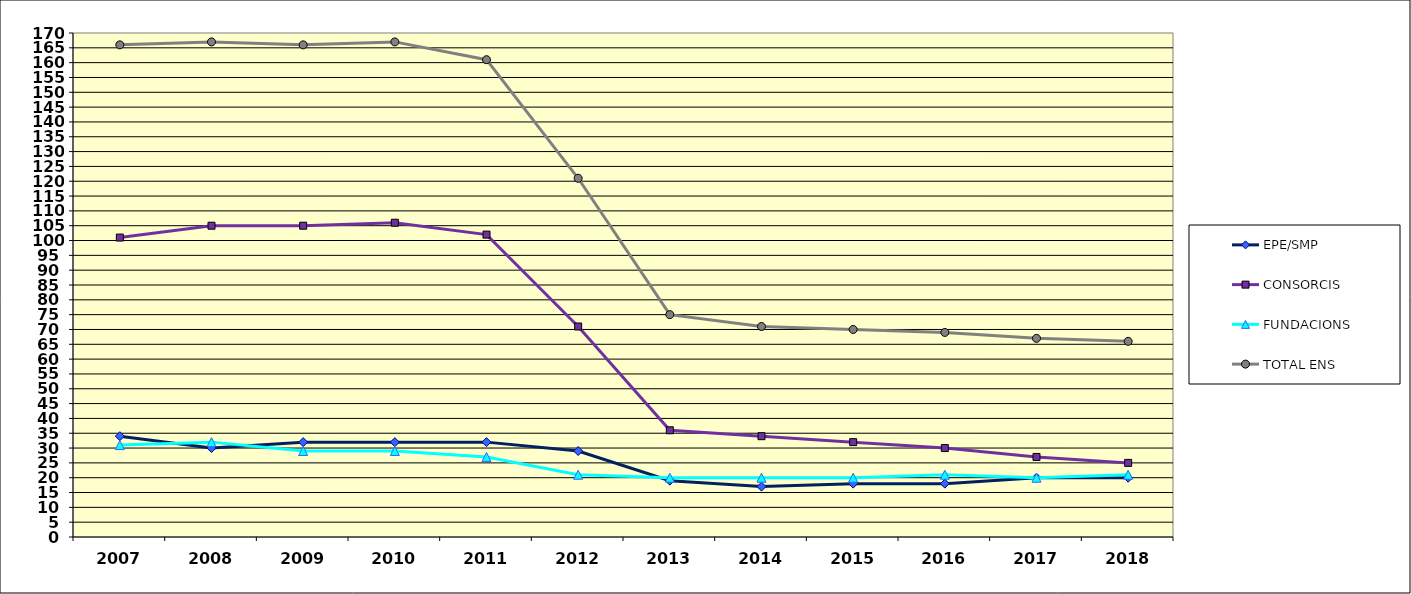
| Category | EPE/SMP | CONSORCIS | FUNDACIONS | TOTAL ENS |
|---|---|---|---|---|
| 2007.0 | 34 | 101 | 31 | 166 |
| 2008.0 | 30 | 105 | 32 | 167 |
| 2009.0 | 32 | 105 | 29 | 166 |
| 2010.0 | 32 | 106 | 29 | 167 |
| 2011.0 | 32 | 102 | 27 | 161 |
| 2012.0 | 29 | 71 | 21 | 121 |
| 2013.0 | 19 | 36 | 20 | 75 |
| 2014.0 | 17 | 34 | 20 | 71 |
| 2015.0 | 18 | 32 | 20 | 70 |
| 2016.0 | 18 | 30 | 21 | 69 |
| 2017.0 | 20 | 27 | 20 | 67 |
| 2018.0 | 20 | 25 | 21 | 66 |